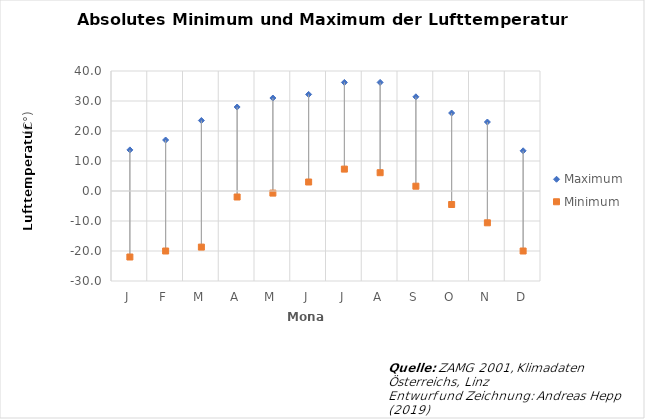
| Category | Maximum | Minimum |
|---|---|---|
| J | 13.7 | -22 |
| F | 17 | -20 |
| M | 23.5 | -18.7 |
| A | 28 | -2 |
| M | 31 | -0.7 |
| J | 32.2 | 3 |
| J | 36.2 | 7.3 |
| A | 36.2 | 6.1 |
| S | 31.4 | 1.6 |
| O | 26 | -4.5 |
| N | 23 | -10.6 |
| D | 13.4 | -20 |